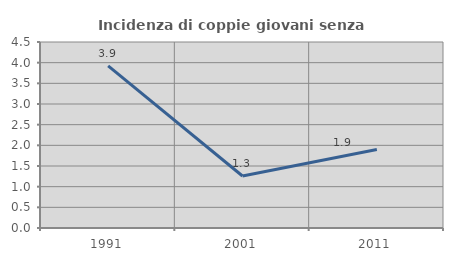
| Category | Incidenza di coppie giovani senza figli |
|---|---|
| 1991.0 | 3.922 |
| 2001.0 | 1.258 |
| 2011.0 | 1.899 |